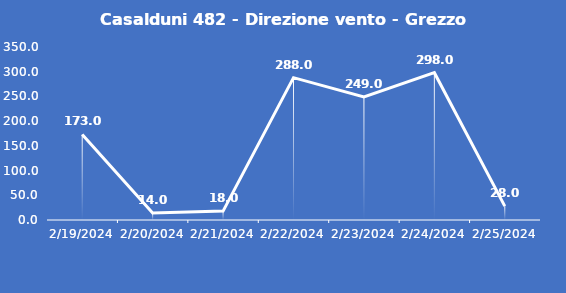
| Category | Casalduni 482 - Direzione vento - Grezzo (°N) |
|---|---|
| 2/19/24 | 173 |
| 2/20/24 | 14 |
| 2/21/24 | 18 |
| 2/22/24 | 288 |
| 2/23/24 | 249 |
| 2/24/24 | 298 |
| 2/25/24 | 28 |